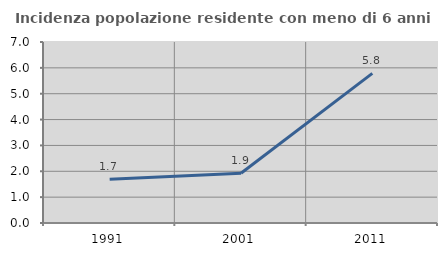
| Category | Incidenza popolazione residente con meno di 6 anni |
|---|---|
| 1991.0 | 1.695 |
| 2001.0 | 1.923 |
| 2011.0 | 5.785 |